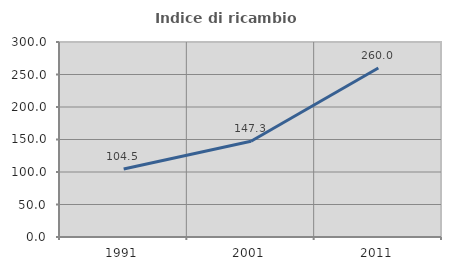
| Category | Indice di ricambio occupazionale  |
|---|---|
| 1991.0 | 104.494 |
| 2001.0 | 147.259 |
| 2011.0 | 260 |